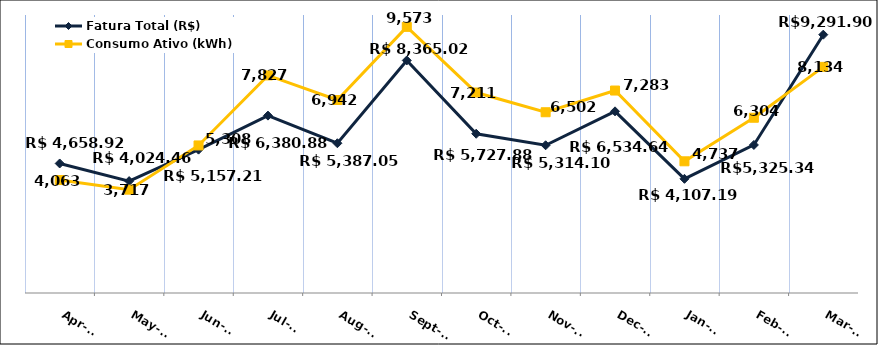
| Category | Fatura Total (R$) |
|---|---|
| 2022-04-01 | 4658.92 |
| 2022-05-01 | 4024.46 |
| 2022-06-01 | 5157.21 |
| 2022-07-01 | 6380.88 |
| 2022-08-01 | 5387.05 |
| 2022-09-01 | 8365.02 |
| 2022-10-01 | 5727.88 |
| 2022-11-01 | 5314.1 |
| 2022-12-01 | 6534.64 |
| 2023-01-01 | 4107.19 |
| 2023-02-01 | 5325.34 |
| 2023-03-01 | 9291.9 |